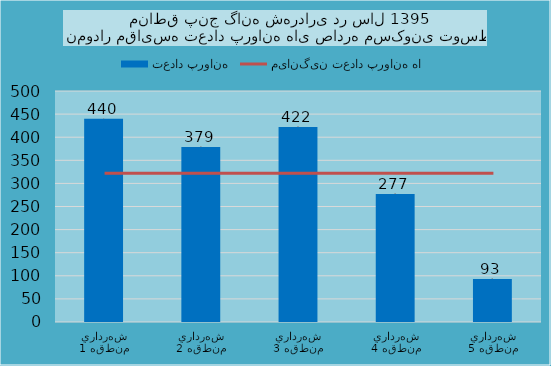
| Category | تعداد پروانه |
|---|---|
| شهرداري منطقه 1 | 440 |
| شهرداري منطقه 2 | 379 |
| شهرداري منطقه 3 | 422 |
| شهرداري منطقه 4 | 277 |
| شهرداري منطقه 5 | 93 |